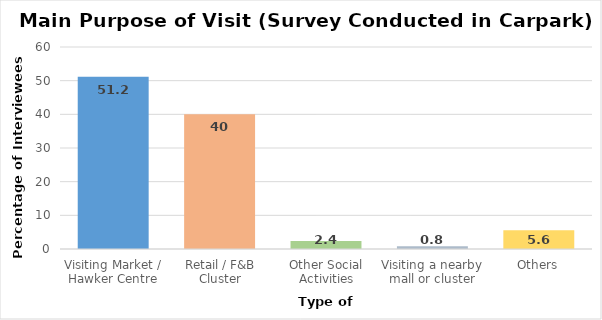
| Category | Series 0 |
|---|---|
| Visiting Market / Hawker Centre | 51.2 |
| Retail / F&B Cluster | 40 |
| Other Social Activities | 2.4 |
| Visiting a nearby mall or cluster | 0.8 |
| Others | 5.6 |